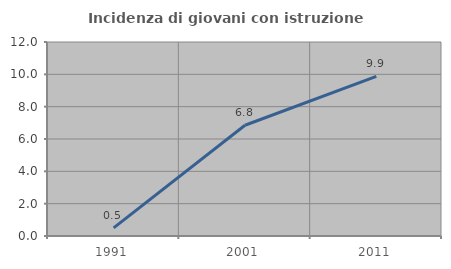
| Category | Incidenza di giovani con istruzione universitaria |
|---|---|
| 1991.0 | 0.503 |
| 2001.0 | 6.849 |
| 2011.0 | 9.868 |